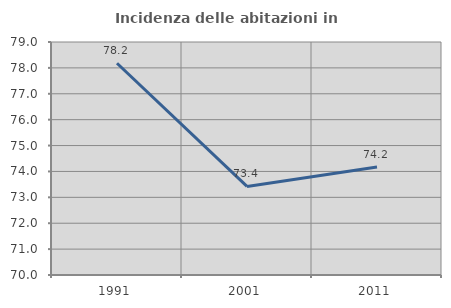
| Category | Incidenza delle abitazioni in proprietà  |
|---|---|
| 1991.0 | 78.18 |
| 2001.0 | 73.421 |
| 2011.0 | 74.173 |